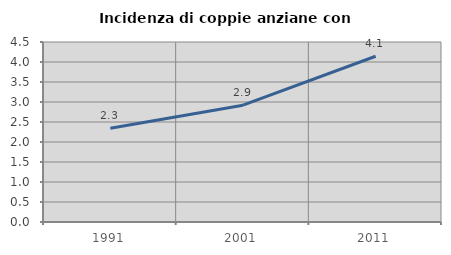
| Category | Incidenza di coppie anziane con figli |
|---|---|
| 1991.0 | 2.342 |
| 2001.0 | 2.92 |
| 2011.0 | 4.144 |